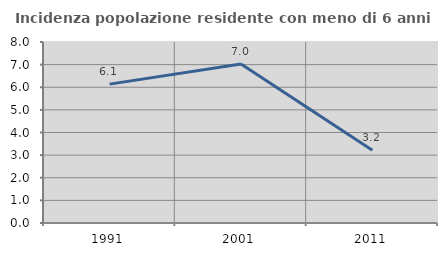
| Category | Incidenza popolazione residente con meno di 6 anni |
|---|---|
| 1991.0 | 6.139 |
| 2001.0 | 7.031 |
| 2011.0 | 3.218 |